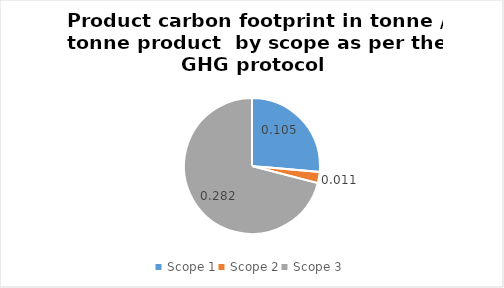
| Category | Series 0 |
|---|---|
| Scope 1 | 0.105 |
| Scope 2 | 0.011 |
| Scope 3 | 0.282 |